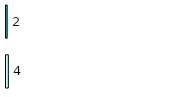
| Category | Series 0 | Series 1 |
|---|---|---|
| 0 | 4 | 2 |